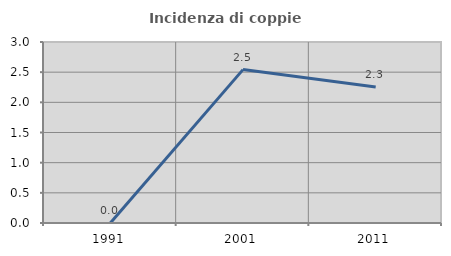
| Category | Incidenza di coppie miste |
|---|---|
| 1991.0 | 0 |
| 2001.0 | 2.542 |
| 2011.0 | 2.256 |